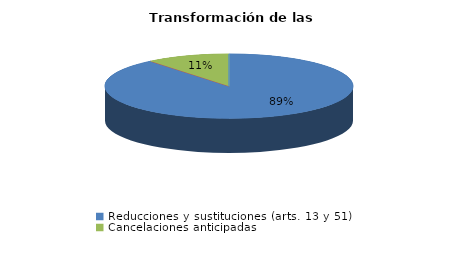
| Category | Series 0 |
|---|---|
| Reducciones y sustituciones (arts. 13 y 51) | 41 |
| Por quebrantamiento (art. 50.2) | 0 |
| Cancelaciones anticipadas | 5 |
| Traslado a Centros Penitenciarios | 0 |
| Conversión internamientos en cerrados (art. 51.2) | 0 |